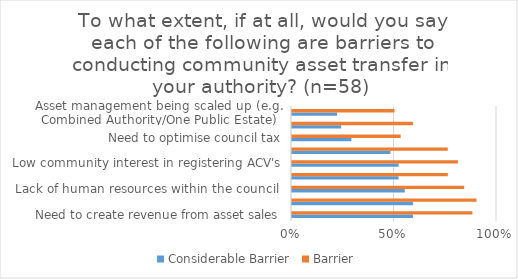
| Category | Considerable Barrier | Barrier |
|---|---|---|
| Need to create revenue from asset sales | 0.59 | 0.88 |
| Lack of appropriate assets for transfer | 0.59 | 0.9 |
| Lack of human resources within the council  | 0.55 | 0.84 |
| Demand for new housing priority | 0.52 | 0.76 |
| Low community interest in registering ACV's  | 0.52 | 0.81 |
| High land value meaning discount too difficult | 0.48 | 0.76 |
| Need to optimise council tax | 0.29 | 0.53 |
| Need to generate business rates | 0.24 | 0.59 |
| Asset management being scaled up (e.g. Combined Authority/One Public Estate) | 0.22 | 0.5 |